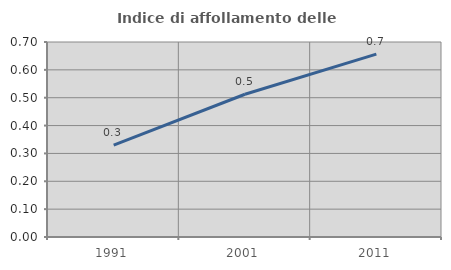
| Category | Indice di affollamento delle abitazioni  |
|---|---|
| 1991.0 | 0.33 |
| 2001.0 | 0.512 |
| 2011.0 | 0.657 |